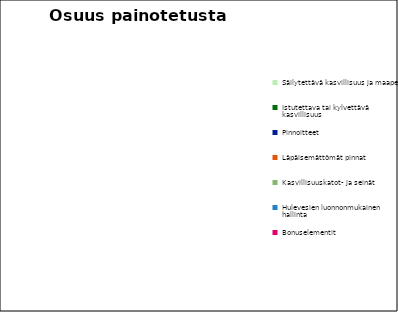
| Category | Series 0 |
|---|---|
| Säilytettävä kasvillisuus ja maaperä | 0 |
| Istutettava tai kylvettävä kasvillisuus | 0 |
| Pinnoitteet | 0 |
| Läpäisemättömät pinnat | 0 |
| Kasvillisuuskatot- ja seinät | 0 |
| Hulevesien luonnonmukainen hallinta | 0 |
| Bonuselementit | 0 |